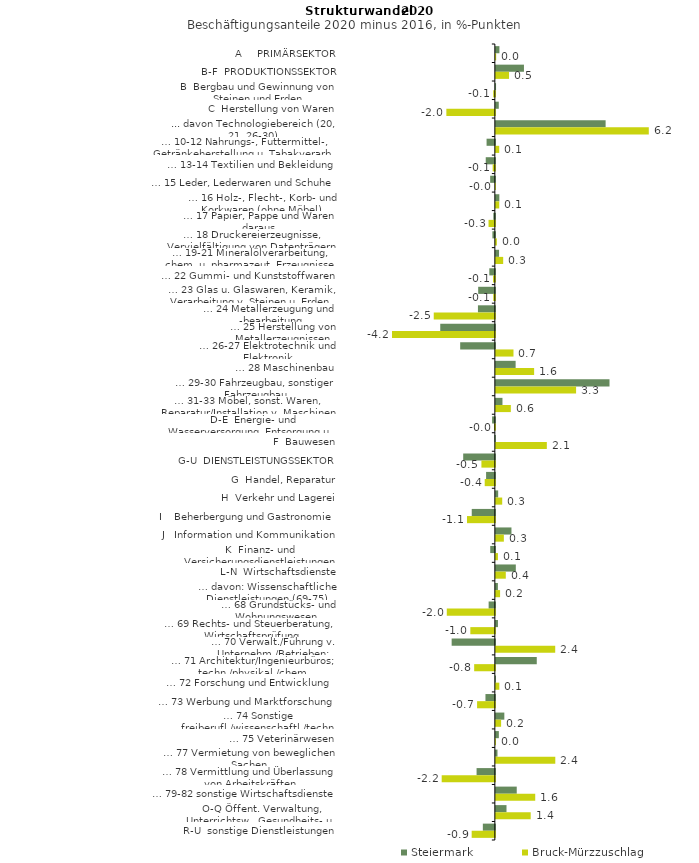
| Category | Steiermark | Bruck-Mürzzuschlag |
|---|---|---|
| A     PRIMÄRSEKTOR | 0.145 | 0.013 |
| B-F  PRODUKTIONSSEKTOR | 1.14 | 0.536 |
| B  Bergbau und Gewinnung von Steinen und Erden | 0.008 | -0.066 |
| C  Herstellung von Waren | 0.118 | -1.968 |
| ... davon Technologiebereich (20, 21, 26-30) | 4.454 | 6.206 |
| … 10-12 Nahrungs-, Futtermittel-, Getränkeherstellung u. Tabakverarb. | -0.336 | 0.137 |
| … 13-14 Textilien und Bekleidung | -0.37 | -0.088 |
| … 15 Leder, Lederwaren und Schuhe | -0.191 | 0 |
| … 16 Holz-, Flecht-, Korb- und Korkwaren (ohne Möbel)  | 0.142 | 0.137 |
| … 17 Papier, Pappe und Waren daraus  | -0.062 | -0.257 |
| … 18 Druckereierzeugnisse, Vervielfältigung von Datenträgern | -0.099 | 0.041 |
| … 19-21 Mineralölverarbeitung, chem. u. pharmazeut. Erzeugnisse | 0.129 | 0.297 |
| … 22 Gummi- und Kunststoffwaren | -0.225 | -0.073 |
| … 23 Glas u. Glaswaren, Keramik, Verarbeitung v. Steinen u. Erden  | -0.677 | -0.065 |
| … 24 Metallerzeugung und -bearbeitung | -0.687 | -2.48 |
| … 25 Herstellung von Metallerzeugnissen  | -2.216 | -4.174 |
| … 26-27 Elektrotechnik und Elektronik | -1.407 | 0.715 |
| … 28 Maschinenbau | 0.802 | 1.553 |
| … 29-30 Fahrzeugbau, sonstiger Fahrzeugbau | 4.612 | 3.256 |
| … 31-33 Möbel, sonst. Waren, Reparatur/Installation v. Maschinen | 0.268 | 0.608 |
| D-E  Energie- und Wasserversorgung, Entsorgung u. Rückgewinnung | -0.111 | -0.035 |
| F  Bauwesen | -0.015 | 2.069 |
| G-U  DIENSTLEISTUNGSSEKTOR | -1.285 | -0.545 |
| G  Handel, Reparatur | -0.356 | -0.412 |
| H  Verkehr und Lagerei | 0.094 | 0.258 |
| I    Beherbergung und Gastronomie | -0.938 | -1.131 |
| J   Information und Kommunikation | 0.633 | 0.325 |
| K  Finanz- und Versicherungsdienstleistungen | -0.188 | 0.085 |
| L-N  Wirtschaftsdienste | 0.81 | 0.403 |
| … davon: Wissenschaftliche Dienstleistungen (69-75) | 0.083 | 0.172 |
| … 68 Grundstücks- und Wohnungswesen  | -0.253 | -1.95 |
| … 69 Rechts- und Steuerberatung, Wirtschaftsprüfung | 0.086 | -0.995 |
| … 70 Verwalt./Führung v. Unternehm./Betrieben; Unternehmensberat. | -1.753 | 2.409 |
| … 71 Architektur/Ingenieurbüros; techn./physikal./chem. Untersuchung | 1.66 | -0.84 |
| … 72 Forschung und Entwicklung  | 0.004 | 0.141 |
| … 73 Werbung und Marktforschung | -0.382 | -0.721 |
| … 74 Sonstige freiberufl./wissenschaftl./techn. Tätigkeiten | 0.344 | 0.213 |
| … 75 Veterinärwesen | 0.121 | 0.003 |
| … 77 Vermietung von beweglichen Sachen  | 0.066 | 2.412 |
| … 78 Vermittlung und Überlassung von Arbeitskräften | -0.742 | -2.158 |
| … 79-82 sonstige Wirtschaftsdienste | 0.848 | 1.598 |
| O-Q Öffent. Verwaltung, Unterrichtsw., Gesundheits- u. Sozialwesen | 0.432 | 1.414 |
| R-U  sonstige Dienstleistungen | -0.488 | -0.941 |